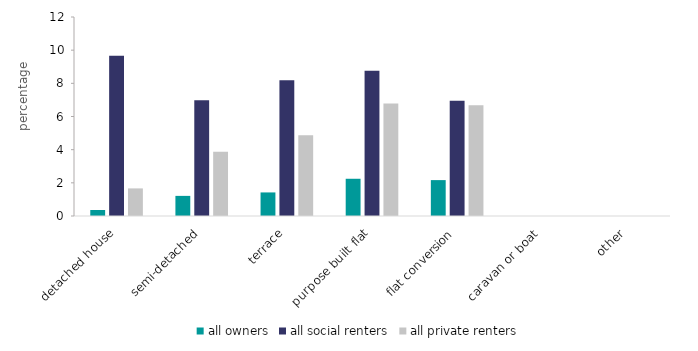
| Category | all owners | all social renters | all private renters |
|---|---|---|---|
|  detached house | 0.363 | 9.666 | 1.664 |
|  semi-detached | 1.213 | 6.985 | 3.867 |
| terrace | 1.421 | 8.18 | 4.867 |
|  purpose built flat | 2.245 | 8.756 | 6.789 |
| flat conversion | 2.164 | 6.955 | 6.681 |
| caravan or boat | 0 | 0 | 0 |
| other | 0 | 0 | 0 |